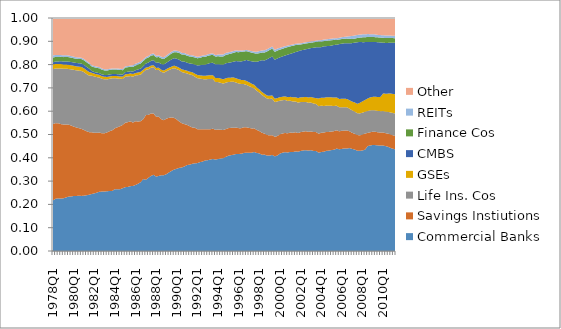
| Category | Commercial Banks | Savings Instiutions | Life Ins. Cos | GSEs | CMBS | Finance Cos | REITs | Other |
|---|---|---|---|---|---|---|---|---|
| 1978Q1 | 0.217 | 0.327 | 0.236 | 0.02 | 0.009 | 0.02 | 0.009 | 0.16 |
| 1978Q2 | 0.224 | 0.325 | 0.235 | 0.019 | 0.011 | 0.02 | 0.009 | 0.159 |
| 1978Q3 | 0.226 | 0.322 | 0.235 | 0.019 | 0.011 | 0.019 | 0.008 | 0.159 |
| 1978Q4 | 0.225 | 0.32 | 0.239 | 0.019 | 0.012 | 0.019 | 0.008 | 0.159 |
| 1979Q1 | 0.226 | 0.317 | 0.239 | 0.019 | 0.013 | 0.019 | 0.008 | 0.16 |
| 1979Q2 | 0.23 | 0.314 | 0.239 | 0.018 | 0.013 | 0.019 | 0.007 | 0.16 |
| 1979Q3 | 0.233 | 0.309 | 0.239 | 0.018 | 0.014 | 0.019 | 0.007 | 0.161 |
| 1979Q4 | 0.234 | 0.305 | 0.241 | 0.018 | 0.014 | 0.019 | 0.007 | 0.163 |
| 1980Q1 | 0.236 | 0.298 | 0.244 | 0.017 | 0.014 | 0.018 | 0.007 | 0.166 |
| 1980Q2 | 0.236 | 0.294 | 0.245 | 0.017 | 0.015 | 0.018 | 0.007 | 0.169 |
| 1980Q3 | 0.237 | 0.29 | 0.247 | 0.017 | 0.015 | 0.018 | 0.006 | 0.169 |
| 1980Q4 | 0.236 | 0.288 | 0.249 | 0.017 | 0.015 | 0.019 | 0.006 | 0.17 |
| 1981Q1 | 0.238 | 0.282 | 0.248 | 0.016 | 0.015 | 0.019 | 0.006 | 0.176 |
| 1981Q2 | 0.239 | 0.275 | 0.246 | 0.016 | 0.015 | 0.02 | 0.006 | 0.184 |
| 1981Q3 | 0.241 | 0.269 | 0.243 | 0.015 | 0.015 | 0.019 | 0.005 | 0.192 |
| 1981Q4 | 0.245 | 0.265 | 0.243 | 0.012 | 0.007 | 0.02 | 0.005 | 0.202 |
| 1982Q1 | 0.247 | 0.26 | 0.242 | 0.012 | 0.007 | 0.02 | 0.005 | 0.206 |
| 1982Q2 | 0.25 | 0.257 | 0.239 | 0.012 | 0.007 | 0.02 | 0.005 | 0.209 |
| 1982Q3 | 0.254 | 0.254 | 0.236 | 0.012 | 0.007 | 0.021 | 0.005 | 0.211 |
| 1982Q4 | 0.255 | 0.25 | 0.234 | 0.011 | 0.007 | 0.02 | 0.005 | 0.217 |
| 1983Q1 | 0.256 | 0.25 | 0.232 | 0.011 | 0.008 | 0.019 | 0.005 | 0.22 |
| 1983Q2 | 0.256 | 0.253 | 0.227 | 0.011 | 0.008 | 0.019 | 0.005 | 0.22 |
| 1983Q3 | 0.258 | 0.257 | 0.225 | 0.01 | 0.009 | 0.019 | 0.005 | 0.218 |
| 1983Q4 | 0.258 | 0.26 | 0.223 | 0.01 | 0.009 | 0.019 | 0.004 | 0.217 |
| 1984Q1 | 0.265 | 0.261 | 0.215 | 0.009 | 0.009 | 0.019 | 0.005 | 0.216 |
| 1984Q2 | 0.265 | 0.266 | 0.209 | 0.01 | 0.008 | 0.02 | 0.005 | 0.217 |
| 1984Q3 | 0.265 | 0.27 | 0.203 | 0.01 | 0.009 | 0.02 | 0.005 | 0.218 |
| 1984Q4 | 0.27 | 0.271 | 0.198 | 0.01 | 0.008 | 0.019 | 0.005 | 0.219 |
| 1985Q1 | 0.274 | 0.276 | 0.198 | 0.01 | 0.01 | 0.02 | 0.005 | 0.207 |
| 1985Q2 | 0.275 | 0.278 | 0.196 | 0.01 | 0.01 | 0.02 | 0.005 | 0.206 |
| 1985Q3 | 0.278 | 0.278 | 0.194 | 0.011 | 0.01 | 0.019 | 0.005 | 0.204 |
| 1985Q4 | 0.279 | 0.272 | 0.197 | 0.011 | 0.01 | 0.02 | 0.007 | 0.202 |
| 1986Q1 | 0.284 | 0.273 | 0.196 | 0.01 | 0.012 | 0.02 | 0.008 | 0.196 |
| 1986Q2 | 0.289 | 0.267 | 0.199 | 0.012 | 0.013 | 0.021 | 0.008 | 0.192 |
| 1986Q3 | 0.295 | 0.262 | 0.2 | 0.012 | 0.014 | 0.022 | 0.008 | 0.187 |
| 1986Q4 | 0.309 | 0.257 | 0.202 | 0.01 | 0.016 | 0.022 | 0.007 | 0.178 |
| 1987Q1 | 0.306 | 0.277 | 0.195 | 0.009 | 0.018 | 0.021 | 0.007 | 0.167 |
| 1987Q2 | 0.314 | 0.27 | 0.196 | 0.009 | 0.019 | 0.022 | 0.006 | 0.163 |
| 1987Q3 | 0.322 | 0.268 | 0.197 | 0.009 | 0.02 | 0.022 | 0.007 | 0.155 |
| 1987Q4 | 0.327 | 0.263 | 0.199 | 0.009 | 0.021 | 0.022 | 0.007 | 0.152 |
| 1988Q1 | 0.319 | 0.257 | 0.201 | 0.009 | 0.022 | 0.023 | 0.007 | 0.162 |
| 1988Q2 | 0.322 | 0.254 | 0.201 | 0.009 | 0.023 | 0.023 | 0.007 | 0.16 |
| 1988Q3 | 0.325 | 0.24 | 0.203 | 0.009 | 0.025 | 0.024 | 0.007 | 0.166 |
| 1988Q4 | 0.325 | 0.236 | 0.204 | 0.009 | 0.026 | 0.023 | 0.008 | 0.168 |
| 1989Q1 | 0.33 | 0.238 | 0.203 | 0.009 | 0.027 | 0.024 | 0.008 | 0.16 |
| 1989Q2 | 0.337 | 0.234 | 0.205 | 0.01 | 0.029 | 0.025 | 0.007 | 0.152 |
| 1989Q3 | 0.344 | 0.23 | 0.208 | 0.01 | 0.031 | 0.025 | 0.007 | 0.145 |
| 1989Q4 | 0.35 | 0.221 | 0.214 | 0.011 | 0.032 | 0.026 | 0.007 | 0.139 |
| 1990Q1 | 0.353 | 0.211 | 0.216 | 0.011 | 0.034 | 0.028 | 0.007 | 0.14 |
| 1990Q2 | 0.357 | 0.198 | 0.22 | 0.011 | 0.034 | 0.029 | 0.007 | 0.143 |
| 1990Q3 | 0.359 | 0.189 | 0.22 | 0.011 | 0.034 | 0.03 | 0.007 | 0.15 |
| 1990Q4 | 0.363 | 0.182 | 0.22 | 0.012 | 0.036 | 0.031 | 0.007 | 0.15 |
| 1991Q1 | 0.369 | 0.172 | 0.221 | 0.012 | 0.035 | 0.03 | 0.006 | 0.156 |
| 1991Q2 | 0.371 | 0.165 | 0.222 | 0.012 | 0.035 | 0.03 | 0.006 | 0.159 |
| 1991Q3 | 0.374 | 0.156 | 0.225 | 0.012 | 0.036 | 0.03 | 0.006 | 0.16 |
| 1991Q4 | 0.376 | 0.153 | 0.219 | 0.013 | 0.039 | 0.03 | 0.006 | 0.163 |
| 1992Q1 | 0.377 | 0.146 | 0.219 | 0.014 | 0.041 | 0.031 | 0.006 | 0.167 |
| 1992Q2 | 0.381 | 0.141 | 0.218 | 0.014 | 0.044 | 0.032 | 0.006 | 0.164 |
| 1992Q3 | 0.384 | 0.138 | 0.216 | 0.014 | 0.047 | 0.033 | 0.006 | 0.161 |
| 1992Q4 | 0.389 | 0.134 | 0.214 | 0.015 | 0.048 | 0.034 | 0.007 | 0.16 |
| 1993Q1 | 0.39 | 0.133 | 0.215 | 0.016 | 0.05 | 0.034 | 0.007 | 0.156 |
| 1993Q2 | 0.393 | 0.13 | 0.216 | 0.016 | 0.053 | 0.034 | 0.006 | 0.153 |
| 1993Q3 | 0.395 | 0.13 | 0.213 | 0.017 | 0.053 | 0.033 | 0.006 | 0.152 |
| 1993Q4 | 0.393 | 0.127 | 0.205 | 0.017 | 0.059 | 0.034 | 0.006 | 0.159 |
| 1994Q1 | 0.395 | 0.127 | 0.204 | 0.018 | 0.059 | 0.034 | 0.007 | 0.157 |
| 1994Q2 | 0.397 | 0.123 | 0.201 | 0.018 | 0.06 | 0.034 | 0.008 | 0.157 |
| 1994Q3 | 0.399 | 0.121 | 0.199 | 0.018 | 0.063 | 0.035 | 0.009 | 0.157 |
| 1994Q4 | 0.404 | 0.119 | 0.199 | 0.019 | 0.065 | 0.036 | 0.008 | 0.15 |
| 1995Q1 | 0.409 | 0.118 | 0.198 | 0.018 | 0.064 | 0.037 | 0.008 | 0.148 |
| 1995Q2 | 0.411 | 0.117 | 0.197 | 0.018 | 0.066 | 0.037 | 0.008 | 0.145 |
| 1995Q3 | 0.413 | 0.115 | 0.198 | 0.018 | 0.068 | 0.038 | 0.008 | 0.142 |
| 1995Q4 | 0.417 | 0.113 | 0.193 | 0.018 | 0.074 | 0.039 | 0.007 | 0.139 |
| 1996Q1 | 0.416 | 0.111 | 0.192 | 0.018 | 0.077 | 0.039 | 0.006 | 0.141 |
| 1996Q2 | 0.417 | 0.11 | 0.189 | 0.018 | 0.079 | 0.041 | 0.006 | 0.139 |
| 1996Q3 | 0.421 | 0.11 | 0.185 | 0.017 | 0.082 | 0.04 | 0.005 | 0.139 |
| 1996Q4 | 0.422 | 0.109 | 0.182 | 0.017 | 0.09 | 0.038 | 0.006 | 0.137 |
| 1997Q1 | 0.422 | 0.107 | 0.179 | 0.016 | 0.092 | 0.038 | 0.006 | 0.14 |
| 1997Q2 | 0.422 | 0.104 | 0.176 | 0.016 | 0.096 | 0.037 | 0.007 | 0.142 |
| 1997Q3 | 0.425 | 0.102 | 0.172 | 0.015 | 0.099 | 0.036 | 0.007 | 0.144 |
| 1997Q4 | 0.421 | 0.099 | 0.168 | 0.014 | 0.11 | 0.035 | 0.008 | 0.145 |
| 1998Q1 | 0.419 | 0.096 | 0.165 | 0.013 | 0.122 | 0.034 | 0.009 | 0.142 |
| 1998Q2 | 0.413 | 0.094 | 0.162 | 0.013 | 0.136 | 0.032 | 0.009 | 0.139 |
| 1998Q3 | 0.414 | 0.09 | 0.158 | 0.013 | 0.143 | 0.034 | 0.01 | 0.139 |
| 1998Q4 | 0.41 | 0.088 | 0.157 | 0.013 | 0.156 | 0.033 | 0.009 | 0.134 |
| 1999Q1 | 0.409 | 0.087 | 0.156 | 0.013 | 0.163 | 0.034 | 0.009 | 0.128 |
| 1999Q2 | 0.412 | 0.085 | 0.156 | 0.014 | 0.167 | 0.034 | 0.009 | 0.122 |
| 1999Q3 | 0.406 | 0.084 | 0.15 | 0.014 | 0.167 | 0.034 | 0.008 | 0.137 |
| 1999Q4 | 0.41 | 0.084 | 0.149 | 0.014 | 0.17 | 0.034 | 0.009 | 0.131 |
| 2000Q1 | 0.418 | 0.083 | 0.144 | 0.015 | 0.171 | 0.033 | 0.008 | 0.128 |
| 2000Q2 | 0.422 | 0.082 | 0.143 | 0.015 | 0.173 | 0.033 | 0.008 | 0.124 |
| 2000Q3 | 0.424 | 0.083 | 0.142 | 0.015 | 0.176 | 0.033 | 0.007 | 0.121 |
| 2000Q4 | 0.423 | 0.082 | 0.139 | 0.016 | 0.182 | 0.033 | 0.006 | 0.118 |
| 2001Q1 | 0.425 | 0.083 | 0.136 | 0.017 | 0.185 | 0.032 | 0.006 | 0.116 |
| 2001Q2 | 0.424 | 0.083 | 0.134 | 0.018 | 0.19 | 0.031 | 0.005 | 0.114 |
| 2001Q3 | 0.428 | 0.082 | 0.132 | 0.018 | 0.193 | 0.03 | 0.005 | 0.111 |
| 2001Q4 | 0.426 | 0.08 | 0.131 | 0.019 | 0.2 | 0.028 | 0.005 | 0.109 |
| 2002Q1 | 0.429 | 0.081 | 0.129 | 0.02 | 0.202 | 0.025 | 0.005 | 0.109 |
| 2002Q2 | 0.432 | 0.08 | 0.127 | 0.021 | 0.203 | 0.025 | 0.005 | 0.107 |
| 2002Q3 | 0.432 | 0.082 | 0.126 | 0.021 | 0.205 | 0.025 | 0.005 | 0.104 |
| 2002Q4 | 0.431 | 0.081 | 0.125 | 0.022 | 0.209 | 0.024 | 0.005 | 0.103 |
| 2003Q1 | 0.433 | 0.081 | 0.124 | 0.024 | 0.21 | 0.024 | 0.005 | 0.1 |
| 2003Q2 | 0.43 | 0.081 | 0.122 | 0.025 | 0.214 | 0.023 | 0.005 | 0.1 |
| 2003Q3 | 0.429 | 0.081 | 0.121 | 0.025 | 0.218 | 0.023 | 0.005 | 0.097 |
| 2003Q4 | 0.422 | 0.081 | 0.118 | 0.033 | 0.22 | 0.024 | 0.006 | 0.095 |
| 2004Q1 | 0.425 | 0.083 | 0.116 | 0.034 | 0.217 | 0.024 | 0.006 | 0.095 |
| 2004Q2 | 0.426 | 0.082 | 0.114 | 0.035 | 0.221 | 0.022 | 0.007 | 0.093 |
| 2004Q3 | 0.43 | 0.081 | 0.113 | 0.036 | 0.219 | 0.023 | 0.007 | 0.092 |
| 2004Q4 | 0.431 | 0.08 | 0.112 | 0.036 | 0.22 | 0.024 | 0.007 | 0.09 |
| 2005Q1 | 0.433 | 0.079 | 0.11 | 0.036 | 0.222 | 0.023 | 0.007 | 0.089 |
| 2005Q2 | 0.435 | 0.08 | 0.108 | 0.036 | 0.226 | 0.022 | 0.007 | 0.087 |
| 2005Q3 | 0.44 | 0.078 | 0.105 | 0.036 | 0.226 | 0.021 | 0.007 | 0.087 |
| 2005Q4 | 0.437 | 0.077 | 0.103 | 0.036 | 0.235 | 0.02 | 0.007 | 0.085 |
| 2006Q1 | 0.438 | 0.078 | 0.101 | 0.036 | 0.237 | 0.02 | 0.008 | 0.082 |
| 2006Q2 | 0.44 | 0.077 | 0.101 | 0.036 | 0.238 | 0.02 | 0.008 | 0.081 |
| 2006Q3 | 0.44 | 0.077 | 0.099 | 0.036 | 0.239 | 0.02 | 0.009 | 0.08 |
| 2006Q4 | 0.442 | 0.072 | 0.097 | 0.036 | 0.244 | 0.019 | 0.011 | 0.078 |
| 2007Q1 | 0.438 | 0.069 | 0.096 | 0.038 | 0.251 | 0.018 | 0.013 | 0.077 |
| 2007Q2 | 0.435 | 0.068 | 0.095 | 0.039 | 0.257 | 0.017 | 0.013 | 0.075 |
| 2007Q3 | 0.431 | 0.067 | 0.094 | 0.04 | 0.264 | 0.018 | 0.013 | 0.073 |
| 2007Q4 | 0.43 | 0.066 | 0.094 | 0.046 | 0.261 | 0.018 | 0.013 | 0.071 |
| 2008Q1 | 0.432 | 0.069 | 0.094 | 0.048 | 0.254 | 0.021 | 0.013 | 0.07 |
| 2008Q2 | 0.435 | 0.069 | 0.094 | 0.051 | 0.248 | 0.021 | 0.013 | 0.069 |
| 2008Q3 | 0.45 | 0.057 | 0.094 | 0.054 | 0.242 | 0.022 | 0.013 | 0.069 |
| 2008Q4 | 0.453 | 0.057 | 0.094 | 0.056 | 0.238 | 0.021 | 0.012 | 0.069 |
| 2009Q1 | 0.455 | 0.057 | 0.093 | 0.057 | 0.236 | 0.021 | 0.012 | 0.069 |
| 2009Q2 | 0.454 | 0.057 | 0.092 | 0.058 | 0.235 | 0.021 | 0.012 | 0.071 |
| 2009Q3 | 0.453 | 0.056 | 0.092 | 0.06 | 0.235 | 0.021 | 0.011 | 0.072 |
| 2009Q4 | 0.453 | 0.055 | 0.092 | 0.061 | 0.233 | 0.021 | 0.011 | 0.073 |
| 2010Q1 | 0.453 | 0.056 | 0.092 | 0.076 | 0.218 | 0.021 | 0.011 | 0.074 |
| 2010Q2 | 0.45 | 0.055 | 0.092 | 0.077 | 0.218 | 0.021 | 0.011 | 0.075 |
| 2010Q3 | 0.447 | 0.056 | 0.094 | 0.079 | 0.218 | 0.021 | 0.011 | 0.075 |
| 2010Q4 | 0.442 | 0.058 | 0.095 | 0.081 | 0.218 | 0.02 | 0.01 | 0.076 |
| 2011Q1 | 0.438 | 0.058 | 0.096 | 0.082 | 0.22 | 0.02 | 0.01 | 0.076 |
| 2011Q2 | 0.435 | 0.057 | 0.098 | 0.082 | 0.223 | 0.019 | 0.011 | 0.076 |